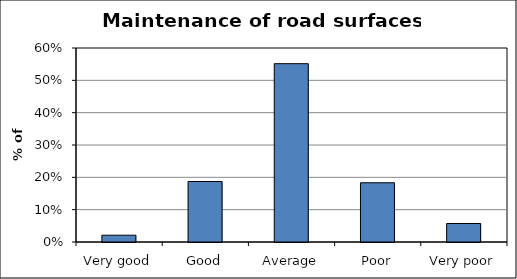
| Category | Series 0 |
|---|---|
| Very good | 0.021 |
| Good | 0.187 |
| Average | 0.552 |
| Poor | 0.183 |
| Very poor | 0.057 |